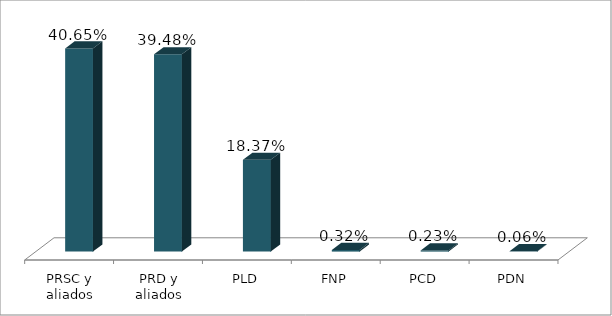
| Category | Votos % |
|---|---|
| PRSC y aliados | 0.406 |
| PRD y aliados | 0.395 |
| PLD | 0.184 |
| FNP | 0.003 |
| PCD | 0.002 |
| PDN | 0.001 |